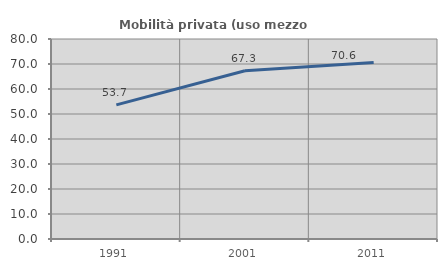
| Category | Mobilità privata (uso mezzo privato) |
|---|---|
| 1991.0 | 53.654 |
| 2001.0 | 67.274 |
| 2011.0 | 70.581 |